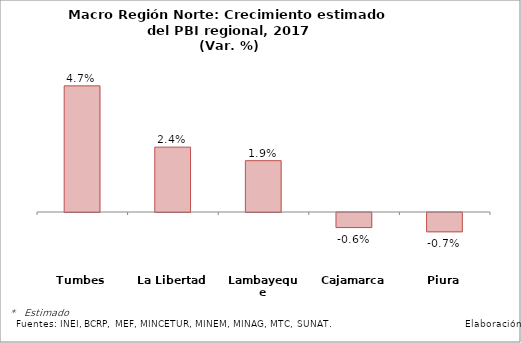
| Category | Series 0 |
|---|---|
| Tumbes | 0.047 |
| La Libertad | 0.024 |
| Lambayeque | 0.019 |
| Cajamarca | -0.006 |
| Piura | -0.007 |